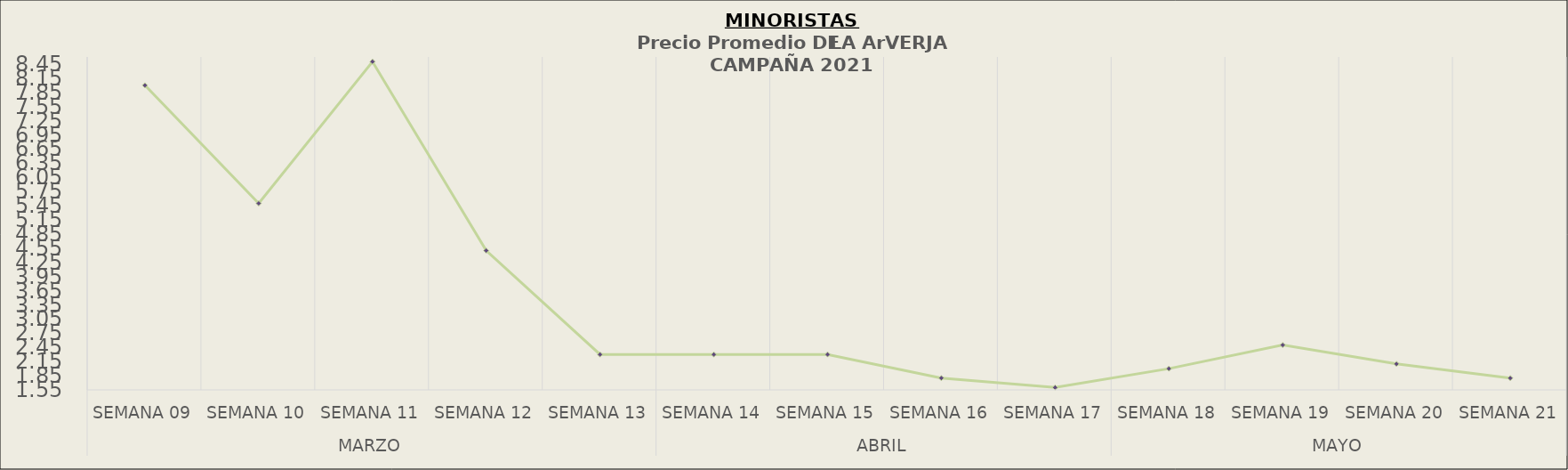
| Category | Precio Promedio ( S/.x Kg.) |
|---|---|
| 0 | 8 |
| 1 | 5.5 |
| 2 | 8.5 |
| 3 | 4.5 |
| 4 | 2.3 |
| 5 | 2.3 |
| 6 | 2.3 |
| 7 | 1.8 |
| 8 | 1.6 |
| 9 | 2 |
| 10 | 2.5 |
| 11 | 2.1 |
| 12 | 1.8 |